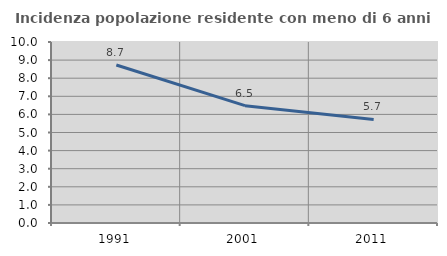
| Category | Incidenza popolazione residente con meno di 6 anni |
|---|---|
| 1991.0 | 8.732 |
| 2001.0 | 6.481 |
| 2011.0 | 5.722 |